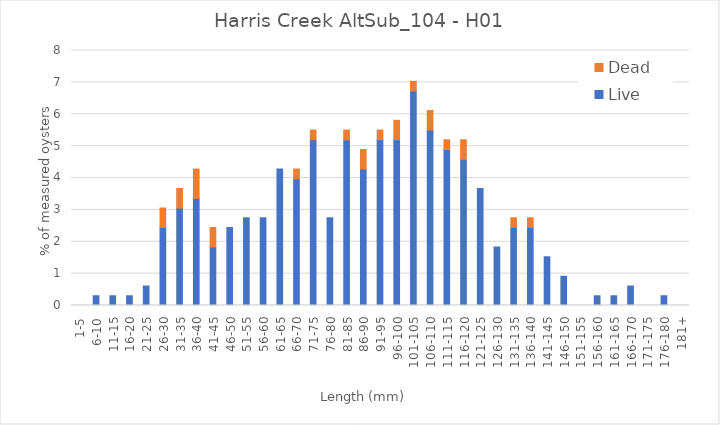
| Category | Live | Dead |
|---|---|---|
| 1-5 | 0 | 0 |
| 6-10 | 0.306 | 0 |
| 11-15 | 0.306 | 0 |
| 16-20 | 0.306 | 0 |
| 21-25 | 0.612 | 0 |
| 26-30 | 2.446 | 0.612 |
| 31-35 | 3.058 | 0.612 |
| 36-40 | 3.364 | 0.917 |
| 41-45 | 1.835 | 0.612 |
| 46-50 | 2.446 | 0 |
| 51-55 | 2.752 | 0 |
| 56-60 | 2.752 | 0 |
| 61-65 | 4.281 | 0 |
| 66-70 | 3.976 | 0.306 |
| 71-75 | 5.199 | 0.306 |
| 76-80 | 2.752 | 0 |
| 81-85 | 5.199 | 0.306 |
| 86-90 | 4.281 | 0.612 |
| 91-95 | 5.199 | 0.306 |
| 96-100 | 5.199 | 0.612 |
| 101-105 | 6.728 | 0.306 |
| 106-110 | 5.505 | 0.612 |
| 111-115 | 4.893 | 0.306 |
| 116-120 | 4.587 | 0.612 |
| 121-125 | 3.67 | 0 |
| 126-130 | 1.835 | 0 |
| 131-135 | 2.446 | 0.306 |
| 136-140 | 2.446 | 0.306 |
| 141-145 | 1.529 | 0 |
| 146-150 | 0.917 | 0 |
| 151-155 | 0 | 0 |
| 156-160 | 0.306 | 0 |
| 161-165 | 0.306 | 0 |
| 166-170 | 0.612 | 0 |
| 171-175 | 0 | 0 |
| 176-180 | 0.306 | 0 |
| 181+ | 0 | 0 |